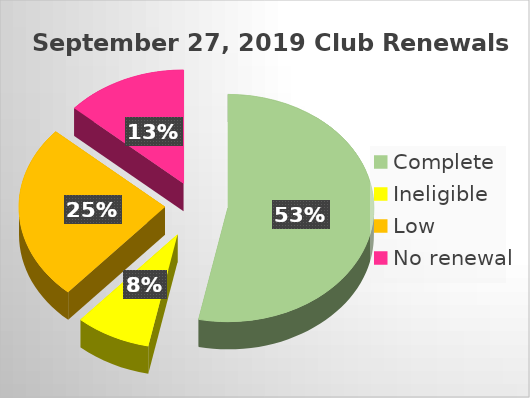
| Category | Series 0 |
|---|---|
| Complete | 0.532 |
| Ineligible | 0.083 |
| Low | 0.25 |
| No renewal | 0.135 |